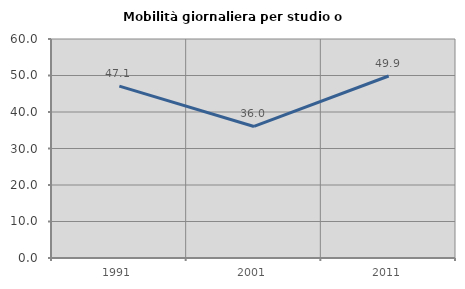
| Category | Mobilità giornaliera per studio o lavoro |
|---|---|
| 1991.0 | 47.089 |
| 2001.0 | 36.041 |
| 2011.0 | 49.859 |